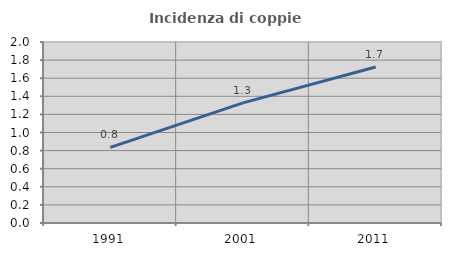
| Category | Incidenza di coppie miste |
|---|---|
| 1991.0 | 0.836 |
| 2001.0 | 1.327 |
| 2011.0 | 1.724 |